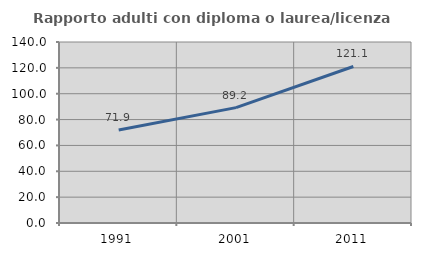
| Category | Rapporto adulti con diploma o laurea/licenza media  |
|---|---|
| 1991.0 | 71.875 |
| 2001.0 | 89.231 |
| 2011.0 | 121.076 |